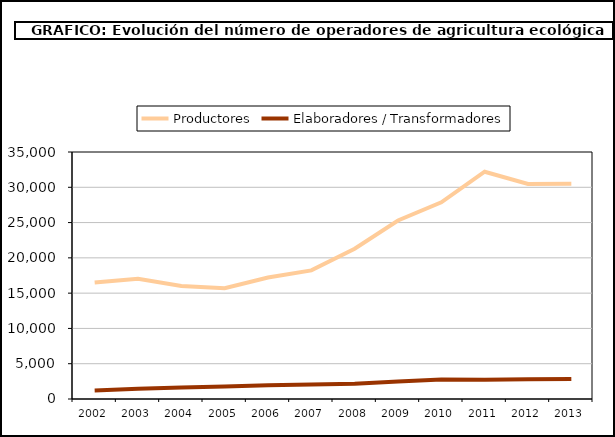
| Category | Productores | Elaboradores / Transformadores |
|---|---|---|
| 2002.0 | 16521 | 1204 |
| 2003.0 | 17028 | 1439 |
| 2004.0 | 16013 | 1635 |
| 2005.0 | 15693 | 1764 |
| 2006.0 | 17214 | 1942 |
| 2007.0 | 18226 | 2061 |
| 2008.0 | 21291 | 2168 |
| 2009.0 | 25291 | 2465 |
| 2010.0 | 27877 | 2747 |
| 2011.0 | 32206 | 2729 |
| 2012.0 | 30462 | 2790 |
| 2013.0 | 30502 | 2842 |